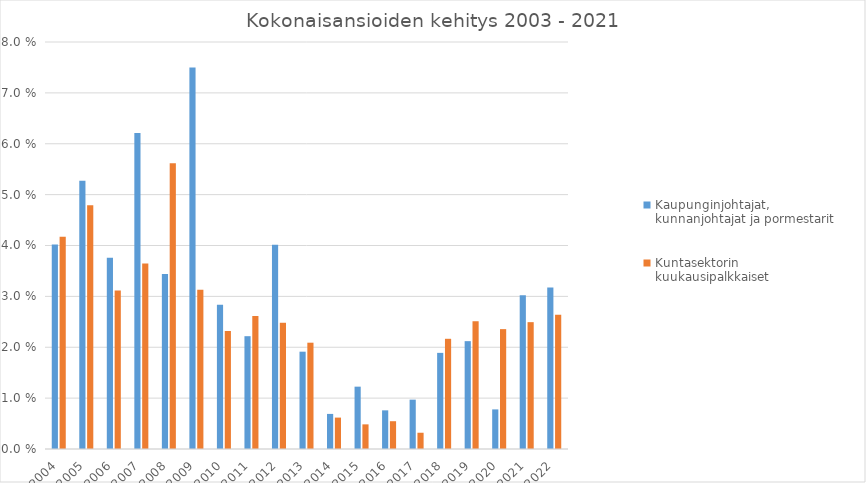
| Category | Kaupunginjohtajat, kunnanjohtajat ja pormestarit | Kuntasektorin kuukausipalkkaiset |
|---|---|---|
| 2004.0 | 0.04 | 0.042 |
| 2005.0 | 0.053 | 0.048 |
| 2006.0 | 0.038 | 0.031 |
| 2007.0 | 0.062 | 0.036 |
| 2008.0 | 0.034 | 0.056 |
| 2009.0 | 0.075 | 0.031 |
| 2010.0 | 0.028 | 0.023 |
| 2011.0 | 0.022 | 0.026 |
| 2012.0 | 0.04 | 0.025 |
| 2013.0 | 0.019 | 0.021 |
| 2014.0 | 0.007 | 0.006 |
| 2015.0 | 0.012 | 0.005 |
| 2016.0 | 0.008 | 0.005 |
| 2017.0 | 0.01 | 0.003 |
| 2018.0 | 0.019 | 0.022 |
| 2019.0 | 0.021 | 0.025 |
| 2020.0 | 0.008 | 0.024 |
| 2021.0 | 0.03 | 0.025 |
| 2022.0 | 0.032 | 0.026 |